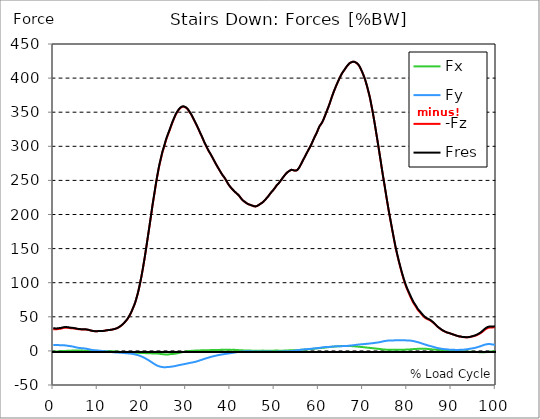
| Category |  Fx |  Fy |  -Fz |  Fres |
|---|---|---|---|---|
| 0.0 | -1.048 | 8.605 | 31.919 | 33.092 |
| 0.167348456675344 | -1.02 | 8.622 | 31.927 | 33.103 |
| 0.334696913350688 | -0.984 | 8.624 | 31.899 | 33.076 |
| 0.5020453700260321 | -0.916 | 8.571 | 31.743 | 32.91 |
| 0.669393826701376 | -0.855 | 8.553 | 31.73 | 32.892 |
| 0.83674228337672 | -0.789 | 8.531 | 31.801 | 32.955 |
| 1.0040907400520642 | -0.714 | 8.536 | 32.013 | 33.16 |
| 1.1621420602454444 | -0.644 | 8.513 | 32.202 | 33.338 |
| 1.3294905169207885 | -0.573 | 8.459 | 32.334 | 33.451 |
| 1.4968389735961325 | -0.493 | 8.401 | 32.424 | 33.522 |
| 1.6641874302714765 | -0.42 | 8.352 | 32.563 | 33.645 |
| 1.8315358869468206 | -0.356 | 8.324 | 32.82 | 33.887 |
| 1.9988843436221646 | -0.299 | 8.311 | 33.171 | 34.226 |
| 2.1662328002975086 | -0.236 | 8.296 | 33.492 | 34.535 |
| 2.333581256972853 | -0.185 | 8.255 | 33.748 | 34.778 |
| 2.5009297136481967 | -0.13 | 8.162 | 33.897 | 34.904 |
| 2.6682781703235405 | -0.072 | 8.052 | 33.959 | 34.939 |
| 2.8356266269988843 | -0.018 | 7.933 | 33.972 | 34.927 |
| 3.002975083674229 | 0.08 | 7.809 | 33.985 | 34.909 |
| 3.1703235403495724 | 0.124 | 7.613 | 33.915 | 34.805 |
| 3.337671997024917 | 0.169 | 7.426 | 33.833 | 34.689 |
| 3.4957233172182973 | 0.218 | 7.27 | 33.707 | 34.533 |
| 3.663071773893641 | 0.273 | 7.114 | 33.512 | 34.309 |
| 3.8304202305689854 | 0.323 | 6.953 | 33.315 | 34.085 |
| 3.997768687244329 | 0.364 | 6.827 | 33.218 | 33.959 |
| 4.165117143919673 | 0.434 | 6.646 | 33.167 | 33.867 |
| 4.332465600595017 | 0.51 | 6.442 | 33.142 | 33.797 |
| 4.499814057270361 | 0.541 | 6.243 | 33.061 | 33.676 |
| 4.667162513945706 | 0.584 | 5.997 | 32.928 | 33.504 |
| 4.834510970621049 | 0.639 | 5.673 | 32.757 | 33.28 |
| 5.001859427296393 | 0.662 | 5.369 | 32.562 | 33.039 |
| 5.169207883971737 | 0.671 | 5.151 | 32.392 | 32.842 |
| 5.336556340647081 | 0.687 | 4.932 | 32.232 | 32.655 |
| 5.503904797322425 | 0.695 | 4.705 | 32.044 | 32.442 |
| 5.671253253997769 | 0.697 | 4.492 | 31.868 | 32.243 |
| 5.82930457419115 | 0.671 | 4.347 | 31.759 | 32.118 |
| 5.996653030866494 | 0.641 | 4.212 | 31.658 | 32.003 |
| 6.164001487541838 | 0.608 | 4.092 | 31.565 | 31.895 |
| 6.331349944217181 | 0.547 | 4.002 | 31.488 | 31.809 |
| 6.498698400892526 | 0.467 | 3.931 | 31.49 | 31.803 |
| 6.66604685756787 | 0.409 | 3.857 | 31.532 | 31.838 |
| 6.833395314243213 | 0.36 | 3.758 | 31.549 | 31.847 |
| 7.000743770918558 | 0.325 | 3.631 | 31.527 | 31.813 |
| 7.168092227593902 | 0.315 | 3.47 | 31.459 | 31.732 |
| 7.335440684269246 | 0.326 | 3.299 | 31.363 | 31.617 |
| 7.50278914094459 | 0.342 | 3.13 | 31.224 | 31.461 |
| 7.6701375976199335 | 0.361 | 2.949 | 31.068 | 31.286 |
| 7.837486054295278 | 0.384 | 2.722 | 30.9 | 31.098 |
| 7.995537374488658 | 0.417 | 2.467 | 30.679 | 30.852 |
| 8.162885831164003 | 0.447 | 2.194 | 30.368 | 30.512 |
| 8.330234287839346 | 0.459 | 1.935 | 30.079 | 30.195 |
| 8.49758274451469 | 0.463 | 1.686 | 29.809 | 29.899 |
| 8.664931201190035 | 0.434 | 1.479 | 29.567 | 29.637 |
| 8.832279657865378 | 0.382 | 1.312 | 29.373 | 29.432 |
| 8.999628114540721 | 0.347 | 1.139 | 29.183 | 29.234 |
| 9.166976571216066 | 0.311 | 0.969 | 29 | 29.044 |
| 9.334325027891412 | 0.247 | 0.867 | 28.935 | 28.975 |
| 9.501673484566755 | 0.191 | 0.772 | 28.876 | 28.913 |
| 9.669021941242098 | 0.146 | 0.673 | 28.841 | 28.874 |
| 9.836370397917442 | 0.099 | 0.579 | 28.865 | 28.896 |
| 10.003718854592787 | 0.042 | 0.499 | 28.934 | 28.964 |
| 10.17106731126813 | -0.02 | 0.424 | 29.015 | 29.042 |
| 10.329118631461512 | -0.098 | 0.38 | 29.192 | 29.217 |
| 10.496467088136853 | -0.111 | 0.287 | 29.219 | 29.238 |
| 10.663815544812199 | -0.11 | 0.168 | 29.226 | 29.239 |
| 10.831164001487544 | -0.096 | 0.021 | 29.225 | 29.232 |
| 10.998512458162887 | -0.131 | -0.069 | 29.252 | 29.259 |
| 11.16586091483823 | -0.176 | -0.149 | 29.286 | 29.292 |
| 11.333209371513574 | -0.236 | -0.26 | 29.351 | 29.36 |
| 11.50055782818892 | -0.292 | -0.377 | 29.472 | 29.483 |
| 11.667906284864264 | -0.328 | -0.508 | 29.673 | 29.689 |
| 11.835254741539607 | -0.365 | -0.624 | 29.886 | 29.906 |
| 12.00260319821495 | -0.43 | -0.68 | 30.133 | 30.156 |
| 12.169951654890292 | -0.478 | -0.781 | 30.352 | 30.379 |
| 12.337300111565641 | -0.484 | -0.953 | 30.431 | 30.463 |
| 12.504648568240984 | -0.49 | -1.109 | 30.51 | 30.547 |
| 12.662699888434362 | -0.503 | -1.268 | 30.644 | 30.688 |
| 12.830048345109708 | -0.498 | -1.42 | 30.778 | 30.827 |
| 12.997396801785053 | -0.511 | -1.565 | 30.914 | 30.968 |
| 13.164745258460396 | -0.539 | -1.696 | 31.067 | 31.128 |
| 13.33209371513574 | -0.588 | -1.812 | 31.269 | 31.339 |
| 13.499442171811083 | -0.644 | -1.915 | 31.516 | 31.592 |
| 13.666790628486426 | -0.72 | -2.001 | 31.823 | 31.906 |
| 13.834139085161771 | -0.751 | -2.127 | 32.09 | 32.18 |
| 14.001487541837117 | -0.81 | -2.225 | 32.38 | 32.478 |
| 14.16883599851246 | -0.897 | -2.295 | 32.692 | 32.796 |
| 14.336184455187803 | -1.01 | -2.352 | 33.065 | 33.177 |
| 14.503532911863147 | -1.118 | -2.402 | 33.554 | 33.672 |
| 14.670881368538492 | -1.218 | -2.462 | 34.128 | 34.252 |
| 14.828932688731873 | -1.309 | -2.521 | 34.779 | 34.908 |
| 14.996281145407215 | -1.414 | -2.587 | 35.467 | 35.601 |
| 15.163629602082558 | -1.498 | -2.656 | 36.186 | 36.326 |
| 15.330978058757903 | -1.557 | -2.731 | 37.017 | 37.162 |
| 15.498326515433247 | -1.65 | -2.839 | 37.907 | 38.061 |
| 15.665674972108594 | -1.749 | -2.979 | 38.87 | 39.037 |
| 15.833023428783937 | -1.827 | -3.084 | 39.898 | 40.074 |
| 16.00037188545928 | -1.916 | -3.168 | 40.988 | 41.171 |
| 16.167720342134626 | -1.989 | -3.242 | 42.169 | 42.359 |
| 16.335068798809967 | -2.036 | -3.338 | 43.419 | 43.616 |
| 16.502417255485312 | -2.081 | -3.448 | 44.666 | 44.869 |
| 16.669765712160658 | -2.145 | -3.542 | 45.948 | 46.158 |
| 16.837114168836 | -2.21 | -3.619 | 47.523 | 47.738 |
| 17.004462625511344 | -2.283 | -3.693 | 49.355 | 49.574 |
| 17.16251394570472 | -2.361 | -3.763 | 51.2 | 51.423 |
| 17.32986240238007 | -2.421 | -3.851 | 53.097 | 53.325 |
| 17.497210859055414 | -2.444 | -3.989 | 55.11 | 55.342 |
| 17.664559315730756 | -2.47 | -4.162 | 57.365 | 57.601 |
| 17.8319077724061 | -2.494 | -4.357 | 59.943 | 60.183 |
| 17.999256229081443 | -2.566 | -4.558 | 62.539 | 62.787 |
| 18.166604685756788 | -2.646 | -4.759 | 65.156 | 65.412 |
| 18.333953142432133 | -2.702 | -4.937 | 67.777 | 68.037 |
| 18.501301599107478 | -2.742 | -5.161 | 70.808 | 71.075 |
| 18.668650055782823 | -2.783 | -5.443 | 74.373 | 74.65 |
| 18.835998512458165 | -2.822 | -5.737 | 78.175 | 78.462 |
| 19.00334696913351 | -2.843 | -6.013 | 82.044 | 82.338 |
| 19.170695425808855 | -2.866 | -6.315 | 86.144 | 86.447 |
| 19.338043882484197 | -2.89 | -6.667 | 90.878 | 91.192 |
| 19.496095202677576 | -2.941 | -7.076 | 95.796 | 96.127 |
| 19.66344365935292 | -2.975 | -7.496 | 100.982 | 101.329 |
| 19.830792116028263 | -2.998 | -7.917 | 106.384 | 106.746 |
| 19.998140572703612 | -3.032 | -8.365 | 112.027 | 112.403 |
| 20.165489029378953 | -3.077 | -8.872 | 118.007 | 118.404 |
| 20.3328374860543 | -3.131 | -9.41 | 124.259 | 124.677 |
| 20.500185942729644 | -3.184 | -9.943 | 130.68 | 131.12 |
| 20.667534399404985 | -3.232 | -10.488 | 137.243 | 137.703 |
| 20.83488285608033 | -3.289 | -11.082 | 144.108 | 144.592 |
| 21.002231312755672 | -3.337 | -11.704 | 151.223 | 151.731 |
| 21.16957976943102 | -3.376 | -12.34 | 158.397 | 158.932 |
| 21.336928226106362 | -3.442 | -12.97 | 165.564 | 166.125 |
| 21.504276682781704 | -3.508 | -13.603 | 172.73 | 173.318 |
| 21.67162513945705 | -3.569 | -14.247 | 179.904 | 180.519 |
| 21.82967645965043 | -3.589 | -14.933 | 187.141 | 187.786 |
| 21.997024916325774 | -3.611 | -15.657 | 194.551 | 195.227 |
| 22.16437337300112 | -3.634 | -16.382 | 201.969 | 202.678 |
| 22.33172182967646 | -3.65 | -17.121 | 209.461 | 210.203 |
| 22.499070286351806 | -3.68 | -17.826 | 216.618 | 217.393 |
| 22.666418743027148 | -3.711 | -18.506 | 223.314 | 224.122 |
| 22.833767199702496 | -3.741 | -19.186 | 229.965 | 230.805 |
| 23.00111565637784 | -3.758 | -19.873 | 236.811 | 237.684 |
| 23.168464113053183 | -3.782 | -20.515 | 243.695 | 244.598 |
| 23.335812569728528 | -3.85 | -21.057 | 250.075 | 251.001 |
| 23.50316102640387 | -3.926 | -21.542 | 256.072 | 257.018 |
| 23.670509483079215 | -4 | -22.019 | 262.004 | 262.968 |
| 23.83785793975456 | -4.085 | -22.479 | 267.866 | 268.849 |
| 23.995909259947936 | -4.229 | -22.808 | 273.069 | 274.063 |
| 24.163257716623285 | -4.368 | -23.055 | 277.611 | 278.611 |
| 24.330606173298627 | -4.528 | -23.307 | 282.258 | 283.264 |
| 24.49795462997397 | -4.687 | -23.558 | 286.904 | 287.918 |
| 24.665303086649313 | -4.829 | -23.757 | 291.37 | 292.386 |
| 24.83265154332466 | -4.947 | -23.824 | 294.911 | 295.923 |
| 25.0 | -5.05 | -23.875 | 298.438 | 299.443 |
| 25.167348456675345 | -5.133 | -23.9 | 302.133 | 303.127 |
| 25.334696913350694 | -5.189 | -23.91 | 305.973 | 306.958 |
| 25.502045370026035 | -5.223 | -23.867 | 309.627 | 310.597 |
| 25.669393826701377 | -5.212 | -23.756 | 312.738 | 313.689 |
| 25.836742283376722 | -5.187 | -23.625 | 315.699 | 316.631 |
| 26.004090740052067 | -5.178 | -23.484 | 318.649 | 319.561 |
| 26.17143919672741 | -4.968 | -23.451 | 321.455 | 322.355 |
| 26.329490516920792 | -4.769 | -23.414 | 324.326 | 325.211 |
| 26.49683897359613 | -4.654 | -23.324 | 327.38 | 328.248 |
| 26.66418743027148 | -4.623 | -23.14 | 330.394 | 331.242 |
| 26.831535886946828 | -4.635 | -22.919 | 333.383 | 334.209 |
| 26.998884343622166 | -4.561 | -22.796 | 336.187 | 336.997 |
| 27.166232800297514 | -4.445 | -22.642 | 338.875 | 339.668 |
| 27.333581256972852 | -4.248 | -22.463 | 341.348 | 342.121 |
| 27.5009297136482 | -4.087 | -22.191 | 343.896 | 344.643 |
| 27.668278170323543 | -3.908 | -21.995 | 346.447 | 347.175 |
| 27.835626626998888 | -3.734 | -21.682 | 348.355 | 349.057 |
| 28.002975083674233 | -3.531 | -21.424 | 350.161 | 350.843 |
| 28.170323540349575 | -3.309 | -21.213 | 351.873 | 352.538 |
| 28.33767199702492 | -3.067 | -21.002 | 353.37 | 354.018 |
| 28.50502045370026 | -2.792 | -20.783 | 354.723 | 355.356 |
| 28.663071773893645 | -2.549 | -20.527 | 355.933 | 356.548 |
| 28.830420230568986 | -2.333 | -20.293 | 356.82 | 357.419 |
| 28.99776868724433 | -2.104 | -20.105 | 357.408 | 357.996 |
| 29.165117143919673 | -1.87 | -19.906 | 357.847 | 358.423 |
| 29.33246560059502 | -1.639 | -19.685 | 358.226 | 358.79 |
| 29.499814057270367 | -1.401 | -19.484 | 358.13 | 358.683 |
| 29.66716251394571 | -1.201 | -19.265 | 357.623 | 358.166 |
| 29.834510970621054 | -0.993 | -19.066 | 357.051 | 357.584 |
| 30.00185942729639 | -0.809 | -18.839 | 356.468 | 356.99 |
| 30.169207883971744 | -0.64 | -18.603 | 355.684 | 356.194 |
| 30.33655634064708 | -0.482 | -18.369 | 354.635 | 355.136 |
| 30.50390479732243 | -0.322 | -18.145 | 353.225 | 353.718 |
| 30.671253253997772 | -0.186 | -17.923 | 351.63 | 352.113 |
| 30.829304574191156 | -0.1 | -17.699 | 349.878 | 350.352 |
| 30.996653030866494 | -0.008 | -17.482 | 348.204 | 348.67 |
| 31.164001487541842 | 0.071 | -17.28 | 346.515 | 346.972 |
| 31.331349944217187 | 0.104 | -17.076 | 344.463 | 344.914 |
| 31.498698400892525 | 0.171 | -16.862 | 342.455 | 342.898 |
| 31.666046857567874 | 0.279 | -16.63 | 340.314 | 340.749 |
| 31.833395314243212 | 0.365 | -16.399 | 337.985 | 338.413 |
| 32.00074377091856 | 0.454 | -16.174 | 335.806 | 336.225 |
| 32.1680922275939 | 0.534 | -15.91 | 333.78 | 334.191 |
| 32.33544068426925 | 0.556 | -15.596 | 331.602 | 331.999 |
| 32.50278914094459 | 0.553 | -15.253 | 329.352 | 329.735 |
| 32.670137597619934 | 0.562 | -14.886 | 327.082 | 327.449 |
| 32.83748605429528 | 0.583 | -14.547 | 324.755 | 325.11 |
| 33.004834510970625 | 0.685 | -14.142 | 322.256 | 322.598 |
| 33.162885831164004 | 0.753 | -13.771 | 319.85 | 320.179 |
| 33.33023428783935 | 0.779 | -13.467 | 317.586 | 317.906 |
| 33.497582744514695 | 0.788 | -13.172 | 315.3 | 315.611 |
| 33.664931201190036 | 0.794 | -12.814 | 312.9 | 313.2 |
| 33.83227965786538 | 0.828 | -12.437 | 310.522 | 310.808 |
| 33.99962811454073 | 0.861 | -11.981 | 307.818 | 308.09 |
| 34.16697657121607 | 0.863 | -11.614 | 305.402 | 305.662 |
| 34.33432502789141 | 0.901 | -11.275 | 303.154 | 303.403 |
| 34.50167348456676 | 0.933 | -10.953 | 300.947 | 301.187 |
| 34.6690219412421 | 0.97 | -10.639 | 298.783 | 299.015 |
| 34.83637039791744 | 1.008 | -10.315 | 296.61 | 296.834 |
| 35.00371885459279 | 1.047 | -9.993 | 294.476 | 294.691 |
| 35.17106731126814 | 1.089 | -9.667 | 292.486 | 292.692 |
| 35.338415767943474 | 1.124 | -9.316 | 290.702 | 290.896 |
| 35.49646708813686 | 1.151 | -8.964 | 288.963 | 289.145 |
| 35.6638155448122 | 1.171 | -8.652 | 287.059 | 287.234 |
| 35.831164001487544 | 1.192 | -8.378 | 285.096 | 285.263 |
| 35.998512458162885 | 1.217 | -8.107 | 283.125 | 283.287 |
| 36.165860914838234 | 1.24 | -7.85 | 281.119 | 281.275 |
| 36.333209371513576 | 1.262 | -7.604 | 279.024 | 279.175 |
| 36.50055782818892 | 1.285 | -7.362 | 276.96 | 277.105 |
| 36.667906284864266 | 1.307 | -7.124 | 275.003 | 275.142 |
| 36.83525474153961 | 1.329 | -6.882 | 273.102 | 273.236 |
| 37.002603198214956 | 1.35 | -6.63 | 271.195 | 271.323 |
| 37.1699516548903 | 1.372 | -6.376 | 269.3 | 269.421 |
| 37.337300111565646 | 1.4 | -6.141 | 267.458 | 267.573 |
| 37.50464856824098 | 1.442 | -5.92 | 265.66 | 265.771 |
| 37.66269988843437 | 1.493 | -5.719 | 263.852 | 263.959 |
| 37.83004834510971 | 1.546 | -5.523 | 262.027 | 262.128 |
| 37.99739680178505 | 1.601 | -5.329 | 260.24 | 260.338 |
| 38.16474525846039 | 1.631 | -5.146 | 258.523 | 258.618 |
| 38.33209371513574 | 1.674 | -4.984 | 257.045 | 257.135 |
| 38.49944217181109 | 1.675 | -4.839 | 255.619 | 255.705 |
| 38.666790628486424 | 1.645 | -4.693 | 254.187 | 254.27 |
| 38.83413908516178 | 1.618 | -4.537 | 252.48 | 252.562 |
| 39.001487541837115 | 1.622 | -4.351 | 250.726 | 250.804 |
| 39.16883599851246 | 1.604 | -4.191 | 248.739 | 248.815 |
| 39.336184455187805 | 1.613 | -4.034 | 246.873 | 246.948 |
| 39.503532911863154 | 1.607 | -3.88 | 245.031 | 245.105 |
| 39.670881368538495 | 1.58 | -3.717 | 243.365 | 243.437 |
| 39.83822982521384 | 1.553 | -3.528 | 241.906 | 241.973 |
| 39.996281145407224 | 1.522 | -3.347 | 240.521 | 240.587 |
| 40.163629602082565 | 1.499 | -3.169 | 239.218 | 239.28 |
| 40.33097805875791 | 1.481 | -2.992 | 237.954 | 238.016 |
| 40.498326515433256 | 1.49 | -2.826 | 236.803 | 236.861 |
| 40.6656749721086 | 1.522 | -2.673 | 235.736 | 235.793 |
| 40.83302342878393 | 1.537 | -2.537 | 234.59 | 234.646 |
| 41.00037188545929 | 1.519 | -2.369 | 233.482 | 233.538 |
| 41.16772034213463 | 1.467 | -2.191 | 232.355 | 232.41 |
| 41.33506879880997 | 1.392 | -1.988 | 231.556 | 231.607 |
| 41.50241725548531 | 1.318 | -1.824 | 230.448 | 230.498 |
| 41.66976571216066 | 1.252 | -1.65 | 229.646 | 229.694 |
| 41.837114168836 | 1.165 | -1.459 | 228.637 | 228.683 |
| 42.004462625511344 | 1.09 | -1.325 | 227.448 | 227.493 |
| 42.17181108218669 | 1.028 | -1.219 | 226.05 | 226.094 |
| 42.32986240238007 | 0.965 | -1.111 | 224.553 | 224.597 |
| 42.497210859055414 | 0.903 | -1.004 | 223.105 | 223.149 |
| 42.66455931573076 | 0.845 | -0.895 | 221.74 | 221.783 |
| 42.831907772406105 | 0.788 | -0.807 | 220.614 | 220.658 |
| 42.999256229081446 | 0.745 | -0.769 | 219.875 | 219.919 |
| 43.16660468575679 | 0.702 | -0.73 | 219.136 | 219.18 |
| 43.33395314243214 | 0.645 | -0.689 | 218.317 | 218.362 |
| 43.50130159910748 | 0.575 | -0.645 | 217.411 | 217.456 |
| 43.66865005578282 | 0.541 | -0.622 | 216.644 | 216.69 |
| 43.83599851245817 | 0.524 | -0.605 | 215.938 | 215.985 |
| 44.00334696913351 | 0.507 | -0.576 | 215.335 | 215.382 |
| 44.17069542580886 | 0.492 | -0.521 | 214.927 | 214.973 |
| 44.3380438824842 | 0.479 | -0.544 | 214.525 | 214.572 |
| 44.49609520267758 | 0.468 | -0.591 | 214.127 | 214.174 |
| 44.66344365935292 | 0.416 | -0.653 | 213.744 | 213.791 |
| 44.83079211602827 | 0.35 | -0.72 | 213.367 | 213.414 |
| 44.99814057270361 | 0.292 | -0.766 | 212.976 | 213.022 |
| 45.16548902937895 | 0.249 | -0.774 | 212.556 | 212.603 |
| 45.332837486054295 | 0.209 | -0.777 | 212.17 | 212.215 |
| 45.500185942729644 | 0.183 | -0.749 | 211.981 | 212.028 |
| 45.66753439940499 | 0.155 | -0.723 | 211.793 | 211.839 |
| 45.83488285608033 | 0.165 | -0.727 | 212.023 | 212.069 |
| 46.00223131275568 | 0.166 | -0.724 | 212.354 | 212.399 |
| 46.16957976943102 | 0.175 | -0.73 | 212.843 | 212.889 |
| 46.336928226106366 | 0.201 | -0.744 | 213.489 | 213.534 |
| 46.50427668278171 | 0.248 | -0.76 | 214.21 | 214.255 |
| 46.671625139457056 | 0.295 | -0.775 | 214.931 | 214.976 |
| 46.829676459650436 | 0.34 | -0.783 | 215.653 | 215.699 |
| 46.99702491632577 | 0.377 | -0.772 | 216.381 | 216.426 |
| 47.16437337300112 | 0.415 | -0.759 | 217.108 | 217.154 |
| 47.33172182967646 | 0.421 | -0.781 | 217.794 | 217.841 |
| 47.49907028635181 | 0.437 | -0.806 | 218.6 | 218.646 |
| 47.66641874302716 | 0.383 | -0.821 | 219.895 | 219.942 |
| 47.83376719970249 | 0.333 | -0.858 | 221.012 | 221.058 |
| 48.001115656377834 | 0.32 | -0.887 | 222.272 | 222.318 |
| 48.16846411305319 | 0.324 | -0.924 | 223.425 | 223.471 |
| 48.33581256972853 | 0.297 | -0.943 | 224.794 | 224.841 |
| 48.50316102640387 | 0.277 | -0.956 | 226.103 | 226.15 |
| 48.67050948307921 | 0.262 | -0.967 | 227.364 | 227.411 |
| 48.837857939754564 | 0.256 | -0.978 | 228.845 | 228.893 |
| 49.005206396429905 | 0.263 | -0.993 | 230.358 | 230.406 |
| 49.163257716623285 | 0.289 | -1.021 | 231.67 | 231.718 |
| 49.33060617329863 | 0.312 | -1.047 | 232.995 | 233.042 |
| 49.49795462997397 | 0.329 | -1.085 | 234.212 | 234.261 |
| 49.66530308664932 | 0.362 | -1.119 | 235.48 | 235.529 |
| 49.832651543324666 | 0.383 | -1.126 | 236.817 | 236.866 |
| 50.0 | 0.399 | -1.124 | 238.175 | 238.225 |
| 50.16734845667534 | 0.414 | -1.107 | 239.696 | 239.746 |
| 50.33469691335069 | 0.435 | -1.084 | 241.242 | 241.293 |
| 50.50204537002604 | 0.475 | -1.051 | 242.748 | 242.799 |
| 50.66939382670139 | 0.463 | -1.017 | 244.018 | 244.068 |
| 50.836742283376715 | 0.416 | -0.952 | 244.917 | 244.964 |
| 51.00409074005207 | 0.365 | -0.903 | 246.231 | 246.277 |
| 51.17143919672741 | 0.345 | -0.865 | 247.561 | 247.605 |
| 51.32949051692079 | 0.32 | -0.826 | 249.031 | 249.074 |
| 51.496838973596134 | 0.305 | -0.791 | 250.546 | 250.588 |
| 51.66418743027148 | 0.315 | -0.769 | 252.028 | 252.07 |
| 51.831535886946824 | 0.339 | -0.74 | 253.551 | 253.593 |
| 51.99888434362217 | 0.373 | -0.688 | 254.975 | 255.016 |
| 52.16623280029752 | 0.455 | -0.655 | 256.374 | 256.416 |
| 52.33358125697285 | 0.532 | -0.625 | 257.769 | 257.81 |
| 52.5009297136482 | 0.579 | -0.581 | 259.115 | 259.158 |
| 52.668278170323546 | 0.601 | -0.515 | 260.396 | 260.441 |
| 52.835626626998895 | 0.627 | -0.482 | 261.436 | 261.481 |
| 53.00297508367424 | 0.668 | -0.481 | 262.23 | 262.276 |
| 53.17032354034958 | 0.735 | -0.484 | 263.081 | 263.127 |
| 53.33767199702492 | 0.8 | -0.477 | 263.878 | 263.926 |
| 53.50502045370027 | 0.859 | -0.431 | 264.463 | 264.51 |
| 53.663071773893655 | 0.904 | -0.359 | 265.105 | 265.151 |
| 53.83042023056899 | 0.935 | -0.26 | 265.518 | 265.562 |
| 53.99776868724433 | 0.953 | -0.145 | 265.639 | 265.679 |
| 54.16511714391967 | 0.906 | 0.005 | 265.088 | 265.124 |
| 54.33246560059503 | 0.851 | 0.158 | 264.614 | 264.646 |
| 54.49981405727037 | 0.821 | 0.305 | 264.498 | 264.528 |
| 54.667162513945705 | 0.854 | 0.512 | 264.395 | 264.421 |
| 54.834510970621054 | 0.93 | 0.751 | 264.329 | 264.354 |
| 55.0018594272964 | 1.031 | 0.936 | 264.463 | 264.486 |
| 55.169207883971744 | 1.125 | 1.03 | 265.279 | 265.303 |
| 55.336556340647086 | 1.222 | 1.124 | 266.437 | 266.462 |
| 55.50390479732243 | 1.325 | 1.242 | 268.054 | 268.08 |
| 55.671253253997776 | 1.43 | 1.364 | 269.771 | 269.797 |
| 55.83860171067312 | 1.511 | 1.518 | 271.792 | 271.82 |
| 55.9966530308665 | 1.575 | 1.689 | 273.883 | 273.914 |
| 56.16400148754184 | 1.652 | 1.829 | 275.96 | 275.992 |
| 56.33134994421718 | 1.725 | 1.95 | 278.024 | 278.057 |
| 56.498698400892536 | 1.782 | 2.09 | 280.189 | 280.224 |
| 56.66604685756788 | 1.852 | 2.2 | 282.24 | 282.276 |
| 56.83339531424321 | 1.927 | 2.304 | 284.285 | 284.323 |
| 57.00074377091856 | 2.005 | 2.387 | 286.364 | 286.403 |
| 57.16809222759391 | 2.079 | 2.469 | 288.461 | 288.502 |
| 57.33544068426925 | 2.136 | 2.555 | 290.532 | 290.574 |
| 57.5027891409446 | 2.206 | 2.649 | 292.622 | 292.667 |
| 57.670137597619934 | 2.28 | 2.736 | 294.667 | 294.713 |
| 57.83748605429528 | 2.389 | 2.805 | 296.592 | 296.64 |
| 58.004834510970625 | 2.51 | 2.887 | 298.582 | 298.632 |
| 58.16288583116401 | 2.627 | 3.01 | 300.761 | 300.813 |
| 58.330234287839346 | 2.737 | 3.15 | 302.986 | 303.041 |
| 58.497582744514695 | 2.868 | 3.278 | 305.264 | 305.322 |
| 58.66493120119004 | 2.999 | 3.401 | 307.697 | 307.758 |
| 58.832279657865385 | 3.141 | 3.514 | 310.113 | 310.175 |
| 58.999628114540734 | 3.276 | 3.626 | 312.528 | 312.593 |
| 59.16697657121607 | 3.373 | 3.748 | 314.815 | 314.881 |
| 59.33432502789142 | 3.449 | 3.883 | 316.921 | 316.989 |
| 59.50167348456676 | 3.539 | 4.007 | 319.105 | 319.174 |
| 59.66902194124211 | 3.695 | 4.083 | 321.669 | 321.74 |
| 59.83637039791745 | 3.84 | 4.174 | 324.209 | 324.282 |
| 60.00371885459278 | 3.996 | 4.255 | 326.749 | 326.825 |
| 60.17106731126813 | 4.126 | 4.352 | 329.252 | 329.329 |
| 60.33841576794349 | 4.187 | 4.566 | 330.809 | 330.889 |
| 60.49646708813685 | 4.261 | 4.78 | 332.339 | 332.42 |
| 60.6638155448122 | 4.386 | 4.984 | 333.942 | 334.029 |
| 60.831164001487544 | 4.499 | 5.155 | 335.809 | 335.899 |
| 60.99851245816289 | 4.591 | 5.277 | 338.089 | 338.183 |
| 61.16586091483824 | 4.691 | 5.434 | 340.641 | 340.738 |
| 61.333209371513576 | 4.8 | 5.542 | 343.354 | 343.453 |
| 61.50055782818892 | 4.918 | 5.604 | 346.104 | 346.205 |
| 61.667906284864266 | 5.04 | 5.649 | 348.878 | 348.981 |
| 61.835254741539615 | 5.163 | 5.68 | 351.669 | 351.774 |
| 62.002603198214956 | 5.297 | 5.707 | 354.453 | 354.559 |
| 62.16995165489029 | 5.442 | 5.755 | 357.268 | 357.375 |
| 62.33730011156564 | 5.572 | 5.842 | 360.177 | 360.287 |
| 62.504648568240995 | 5.691 | 5.952 | 363.182 | 363.294 |
| 62.67199702491633 | 5.83 | 6.03 | 366.463 | 366.577 |
| 62.83004834510971 | 5.947 | 6.135 | 369.73 | 369.847 |
| 62.99739680178505 | 6.045 | 6.266 | 372.854 | 372.973 |
| 63.1647452584604 | 6.125 | 6.375 | 375.886 | 376.008 |
| 63.33209371513575 | 6.205 | 6.483 | 378.82 | 378.944 |
| 63.4994421718111 | 6.289 | 6.572 | 381.622 | 381.749 |
| 63.666790628486424 | 6.376 | 6.643 | 384.366 | 384.495 |
| 63.83413908516177 | 6.478 | 6.704 | 387.018 | 387.149 |
| 64.00148754183712 | 6.575 | 6.782 | 389.556 | 389.689 |
| 64.16883599851248 | 6.679 | 6.821 | 392.036 | 392.171 |
| 64.3361844551878 | 6.787 | 6.854 | 394.461 | 394.598 |
| 64.50353291186315 | 6.893 | 6.874 | 396.889 | 397.028 |
| 64.6708813685385 | 6.954 | 6.904 | 399.208 | 399.348 |
| 64.83822982521384 | 6.989 | 6.931 | 401.451 | 401.592 |
| 65.00557828188919 | 7.011 | 6.953 | 403.639 | 403.78 |
| 65.16362960208257 | 7.027 | 6.972 | 405.718 | 405.859 |
| 65.3309780587579 | 7.052 | 6.982 | 407.574 | 407.715 |
| 65.49832651543326 | 7.068 | 7.016 | 409.268 | 409.408 |
| 65.6656749721086 | 7.109 | 7.079 | 410.752 | 410.894 |
| 65.83302342878395 | 7.13 | 7.122 | 412.239 | 412.382 |
| 66.00037188545929 | 7.103 | 7.139 | 413.812 | 413.955 |
| 66.16772034213463 | 7.054 | 7.197 | 415.431 | 415.574 |
| 66.33506879880998 | 7.034 | 7.268 | 416.962 | 417.106 |
| 66.50241725548531 | 7.032 | 7.339 | 418.401 | 418.547 |
| 66.66976571216065 | 7.068 | 7.437 | 419.596 | 419.744 |
| 66.83711416883601 | 7.079 | 7.599 | 420.703 | 420.854 |
| 67.00446262551135 | 7.089 | 7.76 | 421.809 | 421.963 |
| 67.1718110821867 | 7.079 | 7.823 | 422.431 | 422.586 |
| 67.32986240238007 | 7.068 | 7.909 | 423.022 | 423.179 |
| 67.49721085905541 | 6.996 | 8.036 | 423.508 | 423.667 |
| 67.66455931573076 | 6.891 | 8.172 | 423.809 | 423.968 |
| 67.83190777240611 | 6.833 | 8.309 | 424.001 | 424.161 |
| 67.99925622908145 | 6.722 | 8.445 | 423.912 | 424.074 |
| 68.16660468575678 | 6.641 | 8.589 | 423.566 | 423.73 |
| 68.33395314243214 | 6.564 | 8.755 | 422.966 | 423.134 |
| 68.50130159910749 | 6.49 | 8.912 | 422.327 | 422.497 |
| 68.66865005578282 | 6.409 | 9.048 | 421.579 | 421.749 |
| 68.83599851245816 | 6.296 | 9.155 | 420.564 | 420.737 |
| 69.00334696913352 | 6.173 | 9.263 | 419.235 | 419.41 |
| 69.17069542580886 | 6.059 | 9.377 | 417.671 | 417.847 |
| 69.3380438824842 | 5.941 | 9.487 | 415.611 | 415.79 |
| 69.50539233915956 | 5.834 | 9.586 | 413.493 | 413.672 |
| 69.66344365935292 | 5.73 | 9.685 | 411.159 | 411.341 |
| 69.83079211602826 | 5.626 | 9.785 | 408.718 | 408.901 |
| 69.99814057270362 | 5.531 | 9.876 | 406.106 | 406.292 |
| 70.16548902937896 | 5.426 | 9.97 | 403.313 | 403.5 |
| 70.33283748605429 | 5.305 | 10.08 | 400.455 | 400.644 |
| 70.50018594272964 | 5.183 | 10.177 | 397.459 | 397.651 |
| 70.667534399405 | 5.049 | 10.257 | 393.792 | 393.985 |
| 70.83488285608033 | 4.902 | 10.372 | 390.01 | 390.205 |
| 71.00223131275568 | 4.776 | 10.482 | 386.081 | 386.278 |
| 71.16957976943102 | 4.67 | 10.587 | 381.889 | 382.09 |
| 71.33692822610637 | 4.563 | 10.699 | 377.615 | 377.818 |
| 71.50427668278171 | 4.442 | 10.841 | 373.361 | 373.57 |
| 71.67162513945706 | 4.324 | 10.97 | 368.257 | 368.47 |
| 71.8389735961324 | 4.213 | 11.077 | 362.7 | 362.917 |
| 71.99702491632577 | 4.106 | 11.182 | 357.091 | 357.313 |
| 72.16437337300113 | 4.001 | 11.306 | 351.386 | 351.614 |
| 72.33172182967647 | 3.886 | 11.428 | 345.315 | 345.55 |
| 72.49907028635181 | 3.752 | 11.575 | 339.105 | 339.346 |
| 72.66641874302715 | 3.628 | 11.741 | 332.696 | 332.946 |
| 72.8337671997025 | 3.517 | 11.877 | 326.222 | 326.478 |
| 73.00111565637783 | 3.386 | 12.018 | 319.515 | 319.779 |
| 73.16846411305319 | 3.26 | 12.145 | 312.859 | 313.132 |
| 73.33581256972853 | 3.14 | 12.32 | 306.172 | 306.455 |
| 73.50316102640387 | 3.02 | 12.494 | 299.406 | 299.701 |
| 73.67050948307921 | 2.902 | 12.653 | 292.571 | 292.879 |
| 73.83785793975457 | 2.765 | 12.848 | 285.62 | 285.943 |
| 74.00520639642991 | 2.613 | 13.098 | 278.666 | 279.007 |
| 74.16325771662328 | 2.435 | 13.334 | 271.49 | 271.85 |
| 74.33060617329863 | 2.313 | 13.569 | 264.498 | 264.877 |
| 74.49795462997398 | 2.183 | 13.813 | 257.637 | 258.038 |
| 74.66530308664932 | 2.079 | 14.106 | 251.132 | 251.561 |
| 74.83265154332466 | 1.997 | 14.304 | 244.564 | 245.016 |
| 75.00000000000001 | 1.903 | 14.484 | 237.863 | 238.342 |
| 75.16734845667534 | 1.845 | 14.648 | 231.169 | 231.673 |
| 75.3346969133507 | 1.817 | 14.818 | 224.456 | 224.989 |
| 75.50204537002605 | 1.831 | 14.996 | 217.848 | 218.413 |
| 75.66939382670138 | 1.843 | 15.114 | 211.354 | 211.944 |
| 75.83674228337672 | 1.849 | 15.199 | 205.056 | 205.67 |
| 76.00409074005208 | 1.831 | 15.228 | 199.108 | 199.743 |
| 76.17143919672742 | 1.81 | 15.262 | 193.274 | 193.931 |
| 76.33878765340276 | 1.786 | 15.296 | 187.333 | 188.017 |
| 76.49683897359614 | 1.78 | 15.326 | 181.452 | 182.162 |
| 76.66418743027148 | 1.766 | 15.346 | 175.609 | 176.346 |
| 76.83153588694682 | 1.758 | 15.364 | 169.778 | 170.547 |
| 76.99888434362218 | 1.764 | 15.417 | 164.072 | 164.878 |
| 77.16623280029752 | 1.76 | 15.448 | 158.387 | 159.226 |
| 77.33358125697285 | 1.754 | 15.504 | 152.986 | 153.858 |
| 77.5009297136482 | 1.738 | 15.544 | 148.066 | 148.972 |
| 77.66827817032356 | 1.713 | 15.582 | 143.169 | 144.107 |
| 77.83562662699889 | 1.71 | 15.603 | 138.49 | 139.463 |
| 78.00297508367423 | 1.719 | 15.617 | 133.976 | 134.981 |
| 78.17032354034959 | 1.732 | 15.623 | 129.584 | 130.622 |
| 78.33767199702493 | 1.742 | 15.622 | 125.37 | 126.443 |
| 78.50502045370027 | 1.749 | 15.607 | 121.215 | 122.322 |
| 78.67236891037561 | 1.768 | 15.601 | 117.17 | 118.311 |
| 78.83042023056899 | 1.786 | 15.616 | 113.227 | 114.406 |
| 78.99776868724433 | 1.806 | 15.614 | 109.41 | 110.623 |
| 79.16511714391969 | 1.827 | 15.594 | 105.777 | 107.023 |
| 79.33246560059503 | 1.849 | 15.566 | 102.334 | 103.614 |
| 79.49981405727036 | 1.855 | 15.497 | 99.01 | 100.322 |
| 79.66716251394571 | 1.87 | 15.443 | 95.859 | 97.203 |
| 79.83451097062107 | 1.911 | 15.414 | 92.857 | 94.231 |
| 80.00185942729641 | 1.96 | 15.374 | 90.263 | 91.671 |
| 80.16920788397174 | 2.013 | 15.33 | 87.718 | 89.158 |
| 80.33655634064709 | 2.079 | 15.29 | 85.239 | 86.715 |
| 80.50390479732243 | 2.171 | 15.226 | 82.8 | 84.31 |
| 80.67125325399778 | 2.255 | 15.121 | 80.384 | 81.914 |
| 80.83860171067312 | 2.329 | 14.989 | 77.995 | 79.539 |
| 80.99665303086651 | 2.416 | 14.841 | 75.658 | 77.217 |
| 81.16400148754184 | 2.5 | 14.683 | 73.391 | 74.964 |
| 81.3313499442172 | 2.59 | 14.486 | 71.28 | 72.855 |
| 81.49869840089255 | 2.674 | 14.261 | 69.393 | 70.96 |
| 81.66604685756786 | 2.739 | 13.998 | 67.739 | 69.29 |
| 81.83339531424322 | 2.805 | 13.691 | 66.139 | 67.665 |
| 82.00074377091858 | 2.878 | 13.465 | 64.447 | 65.964 |
| 82.16809222759392 | 2.95 | 13.215 | 62.687 | 64.191 |
| 82.33544068426926 | 3.011 | 12.95 | 60.867 | 62.356 |
| 82.50278914094459 | 3.061 | 12.674 | 59.288 | 60.753 |
| 82.67013759761994 | 3.093 | 12.344 | 58.098 | 59.521 |
| 82.83748605429528 | 3.116 | 11.966 | 57.016 | 58.384 |
| 83.00483451097062 | 3.14 | 11.597 | 55.729 | 57.051 |
| 83.17218296764597 | 3.165 | 11.226 | 54.438 | 55.713 |
| 83.33023428783935 | 3.188 | 10.847 | 53.221 | 54.446 |
| 83.4975827445147 | 3.197 | 10.48 | 52.085 | 53.26 |
| 83.66493120119004 | 3.193 | 10.143 | 50.96 | 52.09 |
| 83.83227965786537 | 3.178 | 9.825 | 49.857 | 50.945 |
| 83.99962811454073 | 3.148 | 9.502 | 48.833 | 49.877 |
| 84.16697657121607 | 3.077 | 9.148 | 48.015 | 49.004 |
| 84.33432502789142 | 3.006 | 8.774 | 47.358 | 48.285 |
| 84.50167348456677 | 2.882 | 8.419 | 46.935 | 47.801 |
| 84.6690219412421 | 2.771 | 8.074 | 46.485 | 47.296 |
| 84.83637039791745 | 2.714 | 7.749 | 45.882 | 46.649 |
| 85.0037188545928 | 2.632 | 7.45 | 45.438 | 46.167 |
| 85.17106731126813 | 2.518 | 7.205 | 44.901 | 45.601 |
| 85.33841576794349 | 2.398 | 6.948 | 44.255 | 44.923 |
| 85.50576422461883 | 2.292 | 6.66 | 43.451 | 44.087 |
| 85.66381554481221 | 2.19 | 6.364 | 42.592 | 43.188 |
| 85.83116400148755 | 2.089 | 6.068 | 41.732 | 42.29 |
| 85.99851245816289 | 2.011 | 5.749 | 40.803 | 41.322 |
| 86.16586091483823 | 1.948 | 5.428 | 39.811 | 40.292 |
| 86.33320937151358 | 1.892 | 5.122 | 38.71 | 39.157 |
| 86.50055782818893 | 1.86 | 4.817 | 37.675 | 38.092 |
| 86.66790628486427 | 1.809 | 4.527 | 36.654 | 37.039 |
| 86.83525474153961 | 1.764 | 4.255 | 35.601 | 35.96 |
| 87.00260319821496 | 1.707 | 4 | 34.65 | 34.982 |
| 87.16995165489031 | 1.66 | 3.774 | 33.778 | 34.089 |
| 87.33730011156564 | 1.602 | 3.618 | 33.036 | 33.334 |
| 87.504648568241 | 1.542 | 3.447 | 32.286 | 32.568 |
| 87.67199702491634 | 1.483 | 3.249 | 31.517 | 31.778 |
| 87.83004834510972 | 1.428 | 3.052 | 30.747 | 30.987 |
| 87.99739680178506 | 1.374 | 2.868 | 30.033 | 30.253 |
| 88.1647452584604 | 1.315 | 2.723 | 29.456 | 29.661 |
| 88.33209371513574 | 1.253 | 2.608 | 28.909 | 29.1 |
| 88.49944217181108 | 1.188 | 2.536 | 28.342 | 28.524 |
| 88.66679062848644 | 1.118 | 2.465 | 27.804 | 27.978 |
| 88.83413908516178 | 1.045 | 2.396 | 27.295 | 27.462 |
| 89.00148754183712 | 0.987 | 2.28 | 26.832 | 26.986 |
| 89.16883599851246 | 0.901 | 2.144 | 26.631 | 26.764 |
| 89.33618445518782 | 0.797 | 2.008 | 26.415 | 26.527 |
| 89.50353291186315 | 0.695 | 1.868 | 26.1 | 26.194 |
| 89.6708813685385 | 0.608 | 1.734 | 25.725 | 25.806 |
| 89.83822982521386 | 0.536 | 1.64 | 25.344 | 25.416 |
| 90.00557828188919 | 0.469 | 1.602 | 24.959 | 25.028 |
| 90.16362960208257 | 0.411 | 1.59 | 24.571 | 24.639 |
| 90.3309780587579 | 0.346 | 1.592 | 24.187 | 24.256 |
| 90.49832651543326 | 0.259 | 1.574 | 23.833 | 23.899 |
| 90.66567497210859 | 0.193 | 1.514 | 23.441 | 23.5 |
| 90.83302342878395 | 0.13 | 1.486 | 23.057 | 23.115 |
| 91.00037188545929 | 0.065 | 1.482 | 22.688 | 22.745 |
| 91.16772034213463 | -0.007 | 1.478 | 22.326 | 22.382 |
| 91.33506879880998 | -0.085 | 1.467 | 21.967 | 22.022 |
| 91.50241725548533 | -0.155 | 1.449 | 21.653 | 21.708 |
| 91.66976571216065 | -0.224 | 1.452 | 21.403 | 21.461 |
| 91.83711416883601 | -0.3 | 1.528 | 21.202 | 21.269 |
| 92.00446262551137 | -0.368 | 1.575 | 21.039 | 21.114 |
| 92.1718110821867 | -0.425 | 1.572 | 20.885 | 20.962 |
| 92.33915953886203 | -0.464 | 1.596 | 20.646 | 20.727 |
| 92.49721085905541 | -0.507 | 1.683 | 20.394 | 20.485 |
| 92.66455931573077 | -0.575 | 1.763 | 20.228 | 20.331 |
| 92.83190777240611 | -0.658 | 1.852 | 20.152 | 20.266 |
| 92.99925622908145 | -0.742 | 1.959 | 20.087 | 20.217 |
| 93.1666046857568 | -0.828 | 2.097 | 20.046 | 20.193 |
| 93.33395314243214 | -0.908 | 2.22 | 19.999 | 20.16 |
| 93.50130159910749 | -0.983 | 2.345 | 19.955 | 20.13 |
| 93.66865005578283 | -1.057 | 2.53 | 19.954 | 20.153 |
| 93.83599851245818 | -1.096 | 2.713 | 19.99 | 20.212 |
| 94.00334696913353 | -1.17 | 2.927 | 20.074 | 20.33 |
| 94.17069542580886 | -1.208 | 3.12 | 20.263 | 20.549 |
| 94.3380438824842 | -1.236 | 3.316 | 20.517 | 20.833 |
| 94.50539233915954 | -1.254 | 3.488 | 20.778 | 21.119 |
| 94.66344365935292 | -1.263 | 3.641 | 21.044 | 21.408 |
| 94.83079211602828 | -1.307 | 3.811 | 21.328 | 21.72 |
| 94.99814057270362 | -1.363 | 3.999 | 21.6 | 22.023 |
| 95.16548902937897 | -1.443 | 4.248 | 21.875 | 22.343 |
| 95.33283748605432 | -1.515 | 4.516 | 22.21 | 22.728 |
| 95.50018594272963 | -1.577 | 4.774 | 22.574 | 23.141 |
| 95.66753439940499 | -1.638 | 5.044 | 22.941 | 23.561 |
| 95.83488285608034 | -1.707 | 5.357 | 23.377 | 24.057 |
| 96.00223131275567 | -1.758 | 5.682 | 23.891 | 24.636 |
| 96.16957976943102 | -1.8 | 6.02 | 24.453 | 25.264 |
| 96.33692822610638 | -1.84 | 6.362 | 25.044 | 25.92 |
| 96.50427668278171 | -1.883 | 6.717 | 25.674 | 26.62 |
| 96.67162513945706 | -1.92 | 7.058 | 26.289 | 27.304 |
| 96.8389735961324 | -1.975 | 7.481 | 27.097 | 28.196 |
| 96.99702491632577 | -1.976 | 7.879 | 27.994 | 29.163 |
| 97.16437337300111 | -1.959 | 8.275 | 28.941 | 30.179 |
| 97.33172182967647 | -1.937 | 8.675 | 29.915 | 31.222 |
| 97.49907028635181 | -1.878 | 9.013 | 30.774 | 32.136 |
| 97.66641874302715 | -1.818 | 9.309 | 31.511 | 32.92 |
| 97.8337671997025 | -1.755 | 9.574 | 32.214 | 33.666 |
| 98.00111565637785 | -1.663 | 9.801 | 32.911 | 34.392 |
| 98.16846411305319 | -1.561 | 9.973 | 33.492 | 34.993 |
| 98.33581256972855 | -1.431 | 10.02 | 33.809 | 35.305 |
| 98.50316102640389 | -1.311 | 10.052 | 34.076 | 35.566 |
| 98.67050948307921 | -1.196 | 10.135 | 34.434 | 35.927 |
| 98.83785793975456 | -1.049 | 9.936 | 34.4 | 35.84 |
| 99.0052063964299 | -0.912 | 9.712 | 34.341 | 35.722 |
| 99.17255485310525 | -0.775 | 9.49 | 34.283 | 35.608 |
| 99.33060617329863 | -0.663 | 9.313 | 34.337 | 35.615 |
| 99.49795462997399 | -0.564 | 9.227 | 34.529 | 35.779 |
| 99.66530308664933 | -0.468 | 9.165 | 34.757 | 35.984 |
| 99.83265154332467 | -0.356 | 9.037 | 34.926 | 36.116 |
| 100.0 | -0.26 | 8.973 | 35.154 | 36.321 |